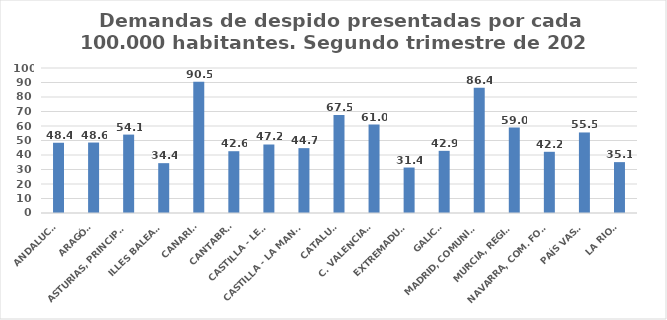
| Category | Series 0 |
|---|---|
| ANDALUCÍA | 48.443 |
| ARAGÓN | 48.59 |
| ASTURIAS, PRINCIPADO | 54.075 |
| ILLES BALEARS | 34.376 |
| CANARIAS | 90.45 |
| CANTABRIA | 42.615 |
| CASTILLA - LEÓN | 47.243 |
| CASTILLA - LA MANCHA | 44.731 |
| CATALUÑA | 67.54 |
| C. VALENCIANA | 60.977 |
| EXTREMADURA | 31.357 |
| GALICIA | 42.869 |
| MADRID, COMUNIDAD | 86.397 |
| MURCIA, REGIÓN | 58.962 |
| NAVARRA, COM. FORAL | 42.207 |
| PAÍS VASCO | 55.546 |
| LA RIOJA | 35.085 |